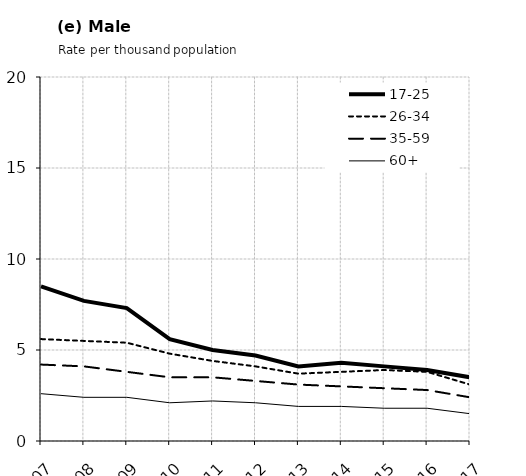
| Category | 17-25 | 26-34 | 35-59 | 60+ |
|---|---|---|---|---|
| 2007.0 | 8.5 | 5.6 | 4.2 | 2.6 |
| 2008.0 | 7.7 | 5.5 | 4.1 | 2.4 |
| 2009.0 | 7.3 | 5.4 | 3.8 | 2.4 |
| 2010.0 | 5.6 | 4.8 | 3.5 | 2.1 |
| 2011.0 | 5 | 4.4 | 3.5 | 2.2 |
| 2012.0 | 4.7 | 4.1 | 3.3 | 2.1 |
| 2013.0 | 4.1 | 3.7 | 3.1 | 1.9 |
| 2014.0 | 4.3 | 3.8 | 3 | 1.9 |
| 2015.0 | 4.1 | 3.9 | 2.9 | 1.8 |
| 2016.0 | 3.9 | 3.8 | 2.8 | 1.8 |
| 2017.0 | 3.5 | 3.1 | 2.4 | 1.5 |